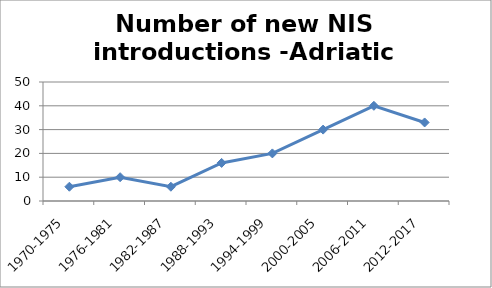
| Category | Number of new NIS introductions -Adriatic Sea |
|---|---|
| 1970-1975 | 6 |
| 1976-1981 | 10 |
| 1982-1987 | 6 |
| 1988-1993 | 16 |
| 1994-1999 | 20 |
| 2000-2005 | 30 |
| 2006-2011 | 40 |
| 2012-2017 | 33 |